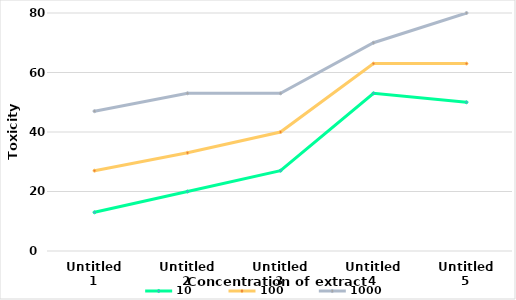
| Category | 10 | 100 | 1000 |
|---|---|---|---|
| 0 | 13 | 27 | 47 |
| 1 | 20 | 33 | 53 |
| 2 | 27 | 40 | 53 |
| 3 | 53 | 63 | 70 |
| 4 | 50 | 63 | 80 |